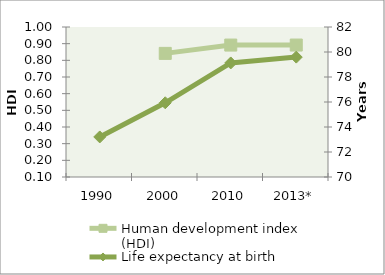
| Category | Human development index (HDI) |
|---|---|
| 1990 | 0 |
| 2000 | 0.842 |
| 2010 | 0.892 |
| 2013* | 0.892 |